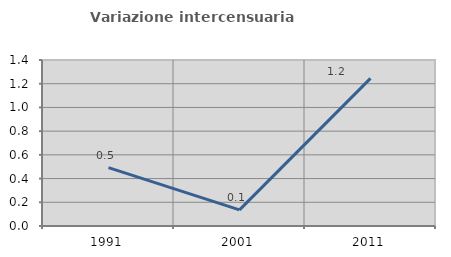
| Category | Variazione intercensuaria annua |
|---|---|
| 1991.0 | 0.493 |
| 2001.0 | 0.136 |
| 2011.0 | 1.245 |